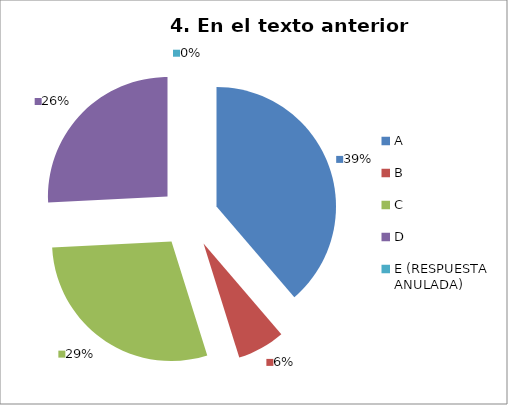
| Category | CANTIDAD DE RESPUESTAS PREGUNTA (4) | PORCENTAJE |
|---|---|---|
| A | 12 | 0.387 |
| B | 2 | 0.065 |
| C | 9 | 0.29 |
| D | 8 | 0.258 |
| E (RESPUESTA ANULADA) | 0 | 0 |